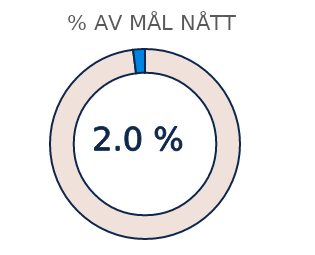
| Category | Series 1 |
|---|---|
| 0 | 0.98 |
| 1 | 0.02 |